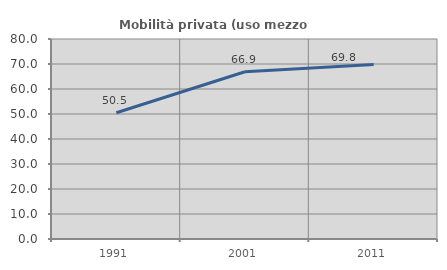
| Category | Mobilità privata (uso mezzo privato) |
|---|---|
| 1991.0 | 50.507 |
| 2001.0 | 66.897 |
| 2011.0 | 69.829 |